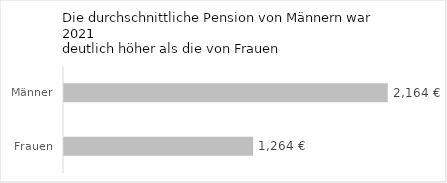
| Category | Durchschnittliche Alterspension 2021 (Brutto, 14 mal pro Jahr) |
|---|---|
| Frauen | 1264 |
| Männer | 2164 |